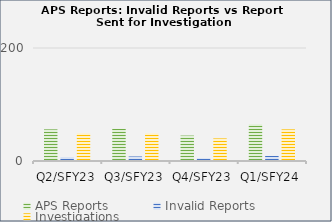
| Category | APS Reports | Invalid Reports | Investigations |
|---|---|---|---|
| Q2/SFY23 | 56 | 7 | 49 |
| Q3/SFY23 | 57 | 8 | 49 |
| Q4/SFY23 | 45 | 5 | 40 |
| Q1/SFY24 | 65 | 9 | 56 |